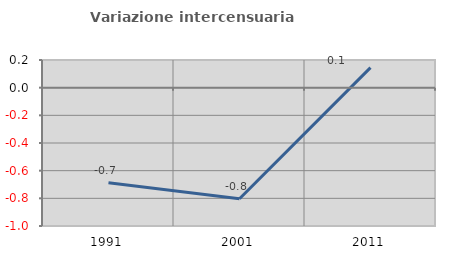
| Category | Variazione intercensuaria annua |
|---|---|
| 1991.0 | -0.688 |
| 2001.0 | -0.803 |
| 2011.0 | 0.145 |